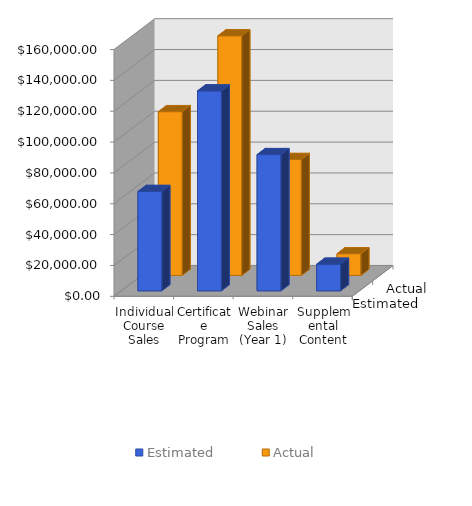
| Category | Estimated | Actual |
|---|---|---|
| Individual Course Sales (Year 1) | 64400 | 106146 |
| Certificate Program Sales (Year 1) | 129600 | 155328 |
| Webinar Sales (Year 1) | 88300 | 75136 |
| Supplemental Content Sales (Year 1) | 17250 | 14070 |